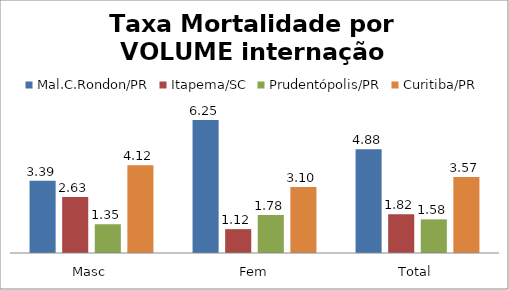
| Category | Mal.C.Rondon/PR | Itapema/SC | Prudentópolis/PR | Toledo/PR | Cascavel/PR | Curitiba/PR |
|---|---|---|---|---|---|---|
| Masc | 3.39 | 2.63 | 1.35 |  |  | 4.12 |
| Fem | 6.25 | 1.12 | 1.78 |  |  | 3.1 |
| Total | 4.88 | 1.82 | 1.58 |  |  | 3.57 |